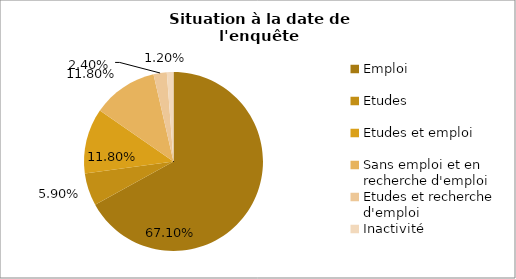
| Category | Promotion 2007 |
|---|---|
| Emploi | 0.671 |
| Etudes | 0.059 |
| Etudes et emploi | 0.118 |
| Sans emploi et en recherche d'emploi | 0.118 |
| Etudes et recherche d'emploi | 0.024 |
| Inactivité | 0.012 |